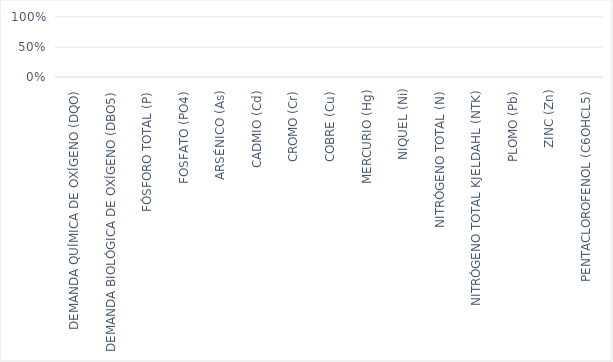
| Category | Impacto en % |
|---|---|
| DEMANDA QUÍMICA DE OXÍGENO (DQO) | 0 |
| DEMANDA BIOLÓGICA DE OXÍGENO (DBO5) | 0 |
| FÓSFORO TOTAL (P) | 0 |
| FOSFATO (PO4) | 0 |
| ARSÉNICO (As) | 0 |
| CADMIO (Cd) | 0 |
| CROMO (Cr) | 0 |
| COBRE (Cu) | 0 |
| MERCURIO (Hg) | 0 |
| NIQUEL (Ni) | 0 |
| NITRÓGENO TOTAL (N) | 0 |
| NITRÓGENO TOTAL KJELDAHL (NTK) | 0 |
| PLOMO (Pb) | 0 |
| ZINC (Zn) | 0 |
| PENTACLOROFENOL (C6OHCL5) | 0 |